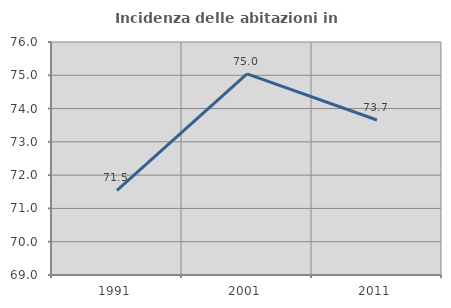
| Category | Incidenza delle abitazioni in proprietà  |
|---|---|
| 1991.0 | 71.545 |
| 2001.0 | 75.041 |
| 2011.0 | 73.657 |